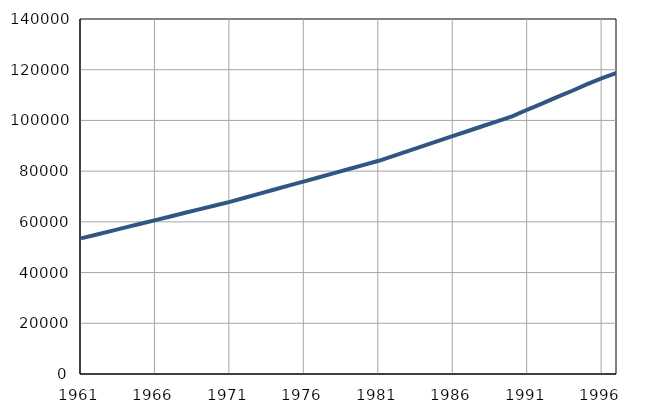
| Category | Population
size |
|---|---|
| 1961.0 | 53476 |
| 1962.0 | 54918 |
| 1963.0 | 56360 |
| 1964.0 | 57802 |
| 1965.0 | 59244 |
| 1966.0 | 60686 |
| 1967.0 | 62128 |
| 1968.0 | 63570 |
| 1969.0 | 65012 |
| 1970.0 | 66454 |
| 1971.0 | 67893 |
| 1972.0 | 69512 |
| 1973.0 | 71131 |
| 1974.0 | 72750 |
| 1975.0 | 74369 |
| 1976.0 | 75988 |
| 1977.0 | 77607 |
| 1978.0 | 79226 |
| 1979.0 | 80845 |
| 1980.0 | 82464 |
| 1981.0 | 84085 |
| 1982.0 | 86044 |
| 1983.0 | 88003 |
| 1984.0 | 89962 |
| 1985.0 | 91921 |
| 1986.0 | 93880 |
| 1987.0 | 95839 |
| 1988.0 | 97798 |
| 1989.0 | 99757 |
| 1990.0 | 101716 |
| 1991.0 | 104300 |
| 1992.0 | 106700 |
| 1993.0 | 109300 |
| 1994.0 | 111700 |
| 1995.0 | 114300 |
| 1996.0 | 116700 |
| 1997.0 | 118800 |